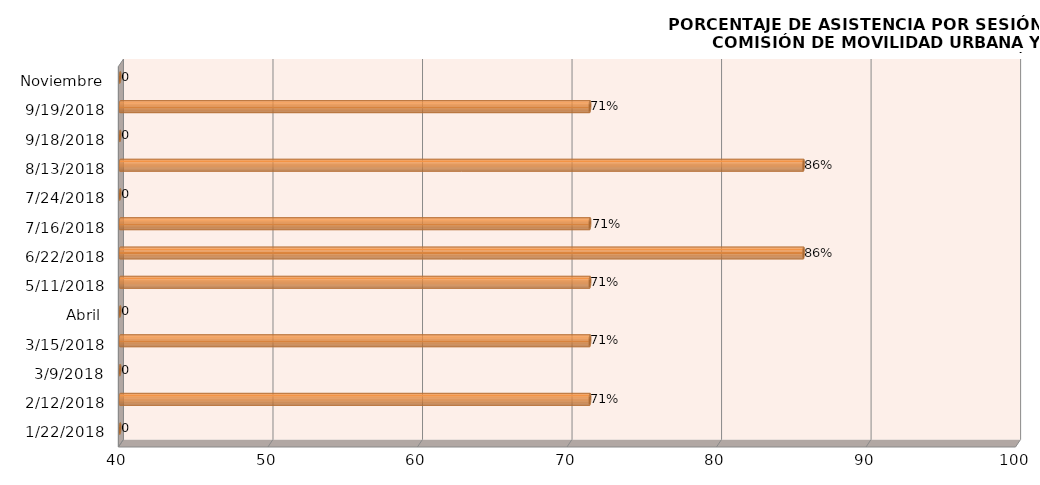
| Category | Series 0 |
|---|---|
| 22/01/2018 | 0 |
| 12/02/2018 | 71.429 |
| 09/03/2018 | 0 |
| 15/03/2018 | 71.429 |
| Abril | 0 |
| 11/05/2018 | 71.429 |
| 22/06/2018 | 85.714 |
| 16/07/2018 | 71.429 |
| 24/07/2018 | 0 |
| 13/08/2018 | 85.714 |
| 18/09/2018 | 0 |
| 19/09/2018 | 71.429 |
| Noviembre | 0 |